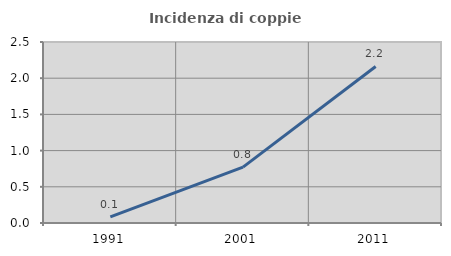
| Category | Incidenza di coppie miste |
|---|---|
| 1991.0 | 0.085 |
| 2001.0 | 0.771 |
| 2011.0 | 2.162 |